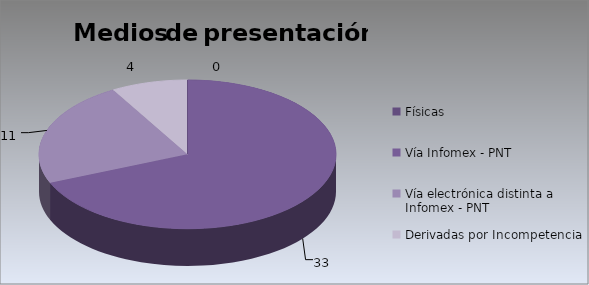
| Category | Series 0 |
|---|---|
| Físicas | 0 |
| Vía Infomex - PNT | 33 |
| Vía electrónica distinta a Infomex - PNT | 11 |
| Derivadas por Incompetencia | 4 |